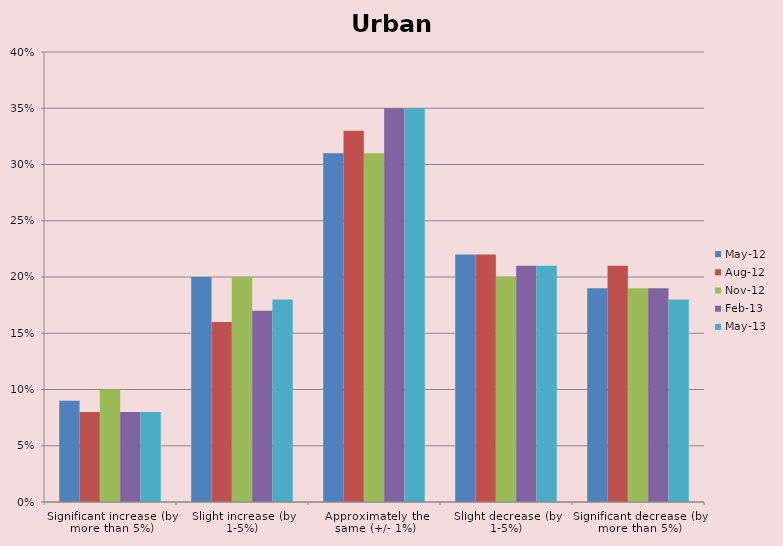
| Category | May-12 | Aug-12 | Nov-12 | Feb-13 | May-13 |
|---|---|---|---|---|---|
| Significant increase (by more than 5%) | 0.09 | 0.08 | 0.1 | 0.08 | 0.08 |
| Slight increase (by 1-5%) | 0.2 | 0.16 | 0.2 | 0.17 | 0.18 |
| Approximately the same (+/- 1%) | 0.31 | 0.33 | 0.31 | 0.35 | 0.35 |
| Slight decrease (by 1-5%) | 0.22 | 0.22 | 0.2 | 0.21 | 0.21 |
| Significant decrease (by more than 5%) | 0.19 | 0.21 | 0.19 | 0.19 | 0.18 |